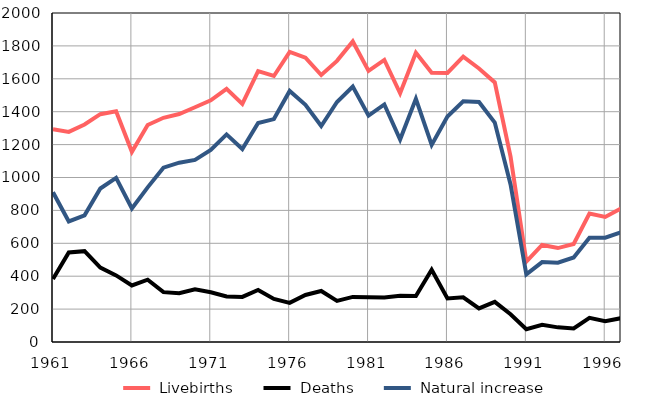
| Category |  Livebirths |  Deaths |  Natural increase |
|---|---|---|---|
| 1961.0 | 1293 | 383 | 910 |
| 1962.0 | 1277 | 544 | 733 |
| 1963.0 | 1322 | 552 | 770 |
| 1964.0 | 1385 | 452 | 933 |
| 1965.0 | 1403 | 405 | 998 |
| 1966.0 | 1156 | 344 | 812 |
| 1967.0 | 1319 | 379 | 940 |
| 1968.0 | 1363 | 303 | 1060 |
| 1969.0 | 1386 | 296 | 1090 |
| 1970.0 | 1427 | 320 | 1107 |
| 1971.0 | 1469 | 302 | 1167 |
| 1972.0 | 1539 | 277 | 1262 |
| 1973.0 | 1447 | 274 | 1173 |
| 1974.0 | 1647 | 316 | 1331 |
| 1975.0 | 1617 | 262 | 1355 |
| 1976.0 | 1764 | 238 | 1526 |
| 1977.0 | 1728 | 286 | 1442 |
| 1978.0 | 1623 | 310 | 1313 |
| 1979.0 | 1709 | 250 | 1459 |
| 1980.0 | 1827 | 274 | 1553 |
| 1981.0 | 1648 | 272 | 1376 |
| 1982.0 | 1715 | 271 | 1444 |
| 1983.0 | 1512 | 281 | 1231 |
| 1984.0 | 1758 | 280 | 1478 |
| 1985.0 | 1637 | 439 | 1198 |
| 1986.0 | 1636 | 265 | 1371 |
| 1987.0 | 1735 | 272 | 1463 |
| 1988.0 | 1663 | 204 | 1459 |
| 1989.0 | 1578 | 244 | 1334 |
| 1990.0 | 1127 | 169 | 958 |
| 1991.0 | 489 | 78 | 411 |
| 1992.0 | 590 | 104 | 486 |
| 1993.0 | 571 | 89 | 482 |
| 1994.0 | 596 | 82 | 514 |
| 1995.0 | 781 | 147 | 634 |
| 1996.0 | 760 | 126 | 634 |
| 1997.0 | 812 | 145 | 667 |